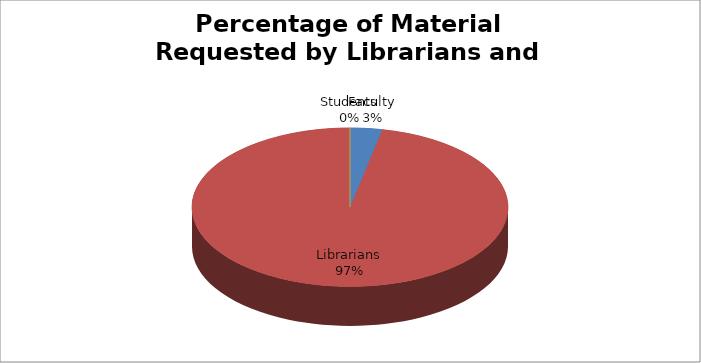
| Category | Series 0 |
|---|---|
| Faculty | 8 |
| Librarians | 236 |
| Students | 0 |